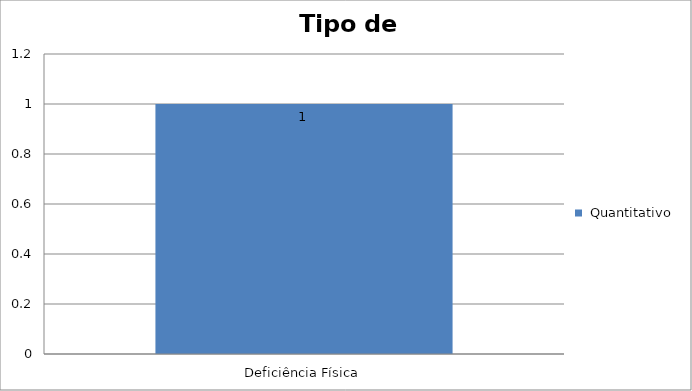
| Category |  Quantitativo |
|---|---|
| Deficiência Física | 1 |